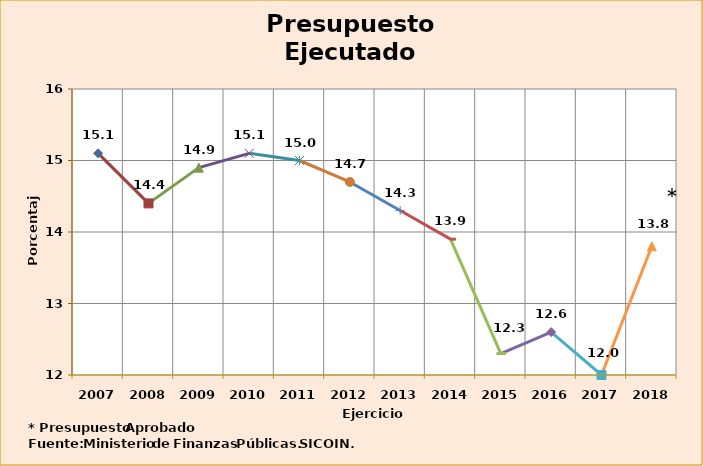
| Category | Series 0 |
|---|---|
| 2007 | 15.1 |
| 2008 | 14.4 |
| 2009 | 14.9 |
| 2010 | 15.1 |
| 2011 | 15 |
| 2012 | 14.7 |
| 2013 | 14.3 |
| 2014 | 13.9 |
| 2015 | 12.3 |
| 2016 | 12.6 |
| 2017 | 12 |
| 2018 | 13.8 |